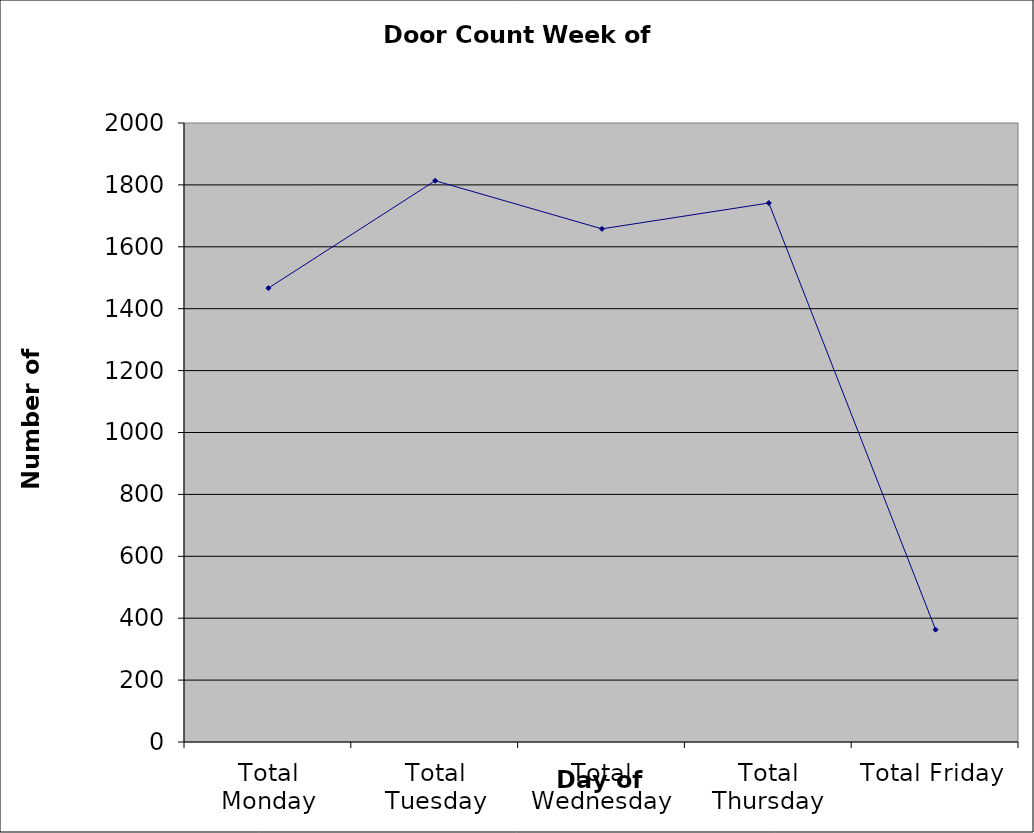
| Category | Series 0 |
|---|---|
| Total Monday | 1466.5 |
| Total Tuesday | 1813.5 |
| Total Wednesday | 1658 |
| Total Thursday | 1741.5 |
| Total Friday | 363 |